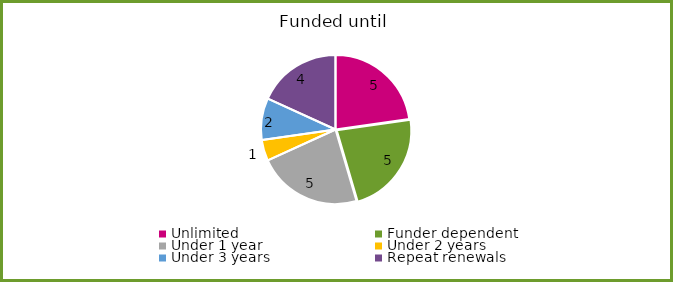
| Category | Series 0 |
|---|---|
| Unlimited | 5 |
| Funder dependent | 5 |
| Under 1 year | 5 |
| Under 2 years | 1 |
| Under 3 years | 2 |
| Repeat renewals | 4 |